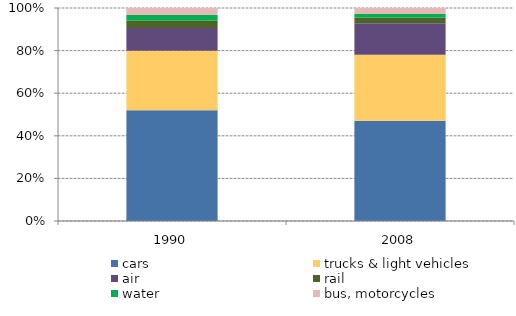
| Category | cars | trucks & light vehicles | air | rail | water | bus, motorcycles |
|---|---|---|---|---|---|---|
| 1990 | 0.52 | 0.279 | 0.107 | 0.035 | 0.026 | 0.033 |
| 2008 | 0.47 | 0.31 | 0.148 | 0.026 | 0.018 | 0.028 |